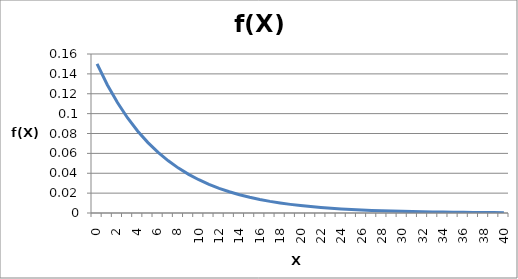
| Category | Series 0 |
|---|---|
| 0.0 | 0.15 |
| 1.0 | 0.129 |
| 2.0 | 0.111 |
| 3.0 | 0.096 |
| 4.0 | 0.082 |
| 5.0 | 0.071 |
| 6.0 | 0.061 |
| 7.0 | 0.052 |
| 8.0 | 0.045 |
| 9.0 | 0.039 |
| 10.0 | 0.033 |
| 11.0 | 0.029 |
| 12.0 | 0.025 |
| 13.0 | 0.021 |
| 14.0 | 0.018 |
| 15.0 | 0.016 |
| 16.0 | 0.014 |
| 17.0 | 0.012 |
| 18.0 | 0.01 |
| 19.0 | 0.009 |
| 20.0 | 0.007 |
| 21.0 | 0.006 |
| 22.0 | 0.006 |
| 23.0 | 0.005 |
| 24.0 | 0.004 |
| 25.0 | 0.004 |
| 26.0 | 0.003 |
| 27.0 | 0.003 |
| 28.0 | 0.002 |
| 29.0 | 0.002 |
| 30.0 | 0.002 |
| 31.0 | 0.001 |
| 32.0 | 0.001 |
| 33.0 | 0.001 |
| 34.0 | 0.001 |
| 35.0 | 0.001 |
| 36.0 | 0.001 |
| 37.0 | 0.001 |
| 38.0 | 0.001 |
| 39.0 | 0 |
| 40.0 | 0 |